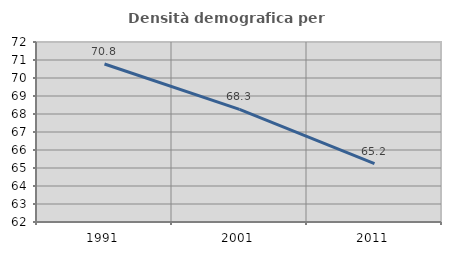
| Category | Densità demografica |
|---|---|
| 1991.0 | 70.78 |
| 2001.0 | 68.254 |
| 2011.0 | 65.247 |